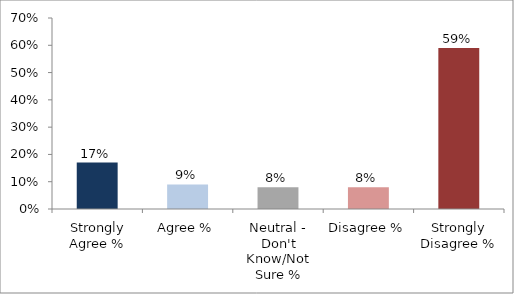
| Category | Share |
|---|---|
| Strongly Agree % | 0.17 |
| Agree % | 0.09 |
| Neutral - Don't Know/Not Sure % | 0.08 |
| Disagree % | 0.08 |
| Strongly Disagree % | 0.59 |